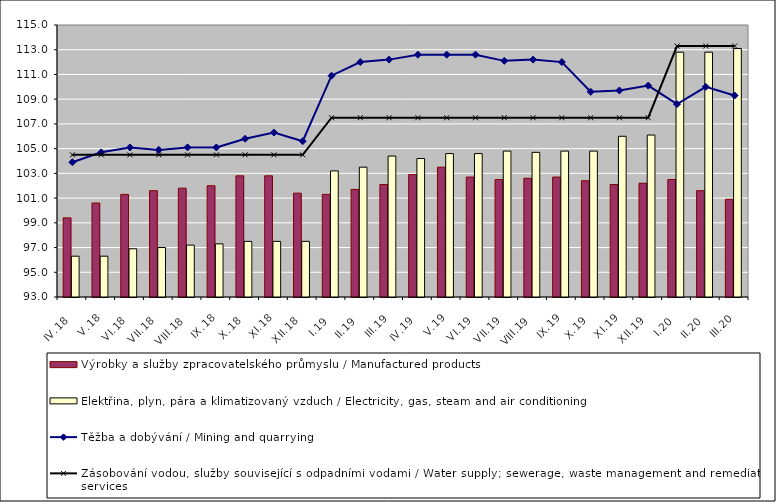
| Category | Výrobky a služby zpracovatelského průmyslu / Manufactured products | Elektřina, plyn, pára a klimatizovaný vzduch / Electricity, gas, steam and air conditioning |
|---|---|---|
| IV.18 | 99.4 | 96.3 |
| V.18 | 100.6 | 96.3 |
| VI.18 | 101.3 | 96.9 |
| VII.18 | 101.6 | 97 |
| VIII.18 | 101.8 | 97.2 |
| IX.18 | 102 | 97.3 |
| X.18 | 102.8 | 97.5 |
| XI.18 | 102.8 | 97.5 |
| XII.18 | 101.4 | 97.5 |
| I.19 | 101.3 | 103.2 |
| II.19 | 101.7 | 103.5 |
| III.19 | 102.1 | 104.4 |
| IV.19 | 102.9 | 104.2 |
| V.19 | 103.5 | 104.6 |
| VI.19 | 102.7 | 104.6 |
| VII.19 | 102.5 | 104.8 |
| VIII.19 | 102.6 | 104.7 |
| IX.19 | 102.7 | 104.8 |
| X.19 | 102.4 | 104.8 |
| XI.19 | 102.1 | 106 |
| XII.19 | 102.2 | 106.1 |
| I.20 | 102.5 | 112.8 |
| II.20 | 101.6 | 112.8 |
| III.20 | 100.9 | 113.1 |